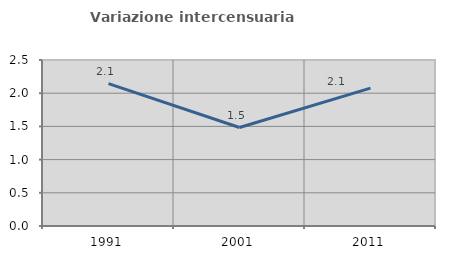
| Category | Variazione intercensuaria annua |
|---|---|
| 1991.0 | 2.144 |
| 2001.0 | 1.483 |
| 2011.0 | 2.077 |